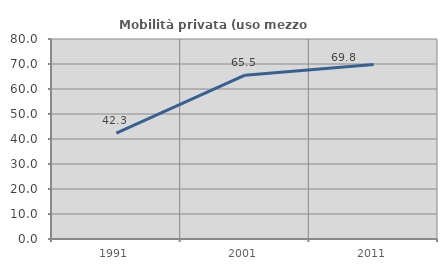
| Category | Mobilità privata (uso mezzo privato) |
|---|---|
| 1991.0 | 42.311 |
| 2001.0 | 65.533 |
| 2011.0 | 69.798 |